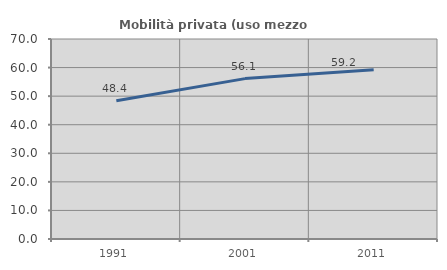
| Category | Mobilità privata (uso mezzo privato) |
|---|---|
| 1991.0 | 48.387 |
| 2001.0 | 56.134 |
| 2011.0 | 59.242 |